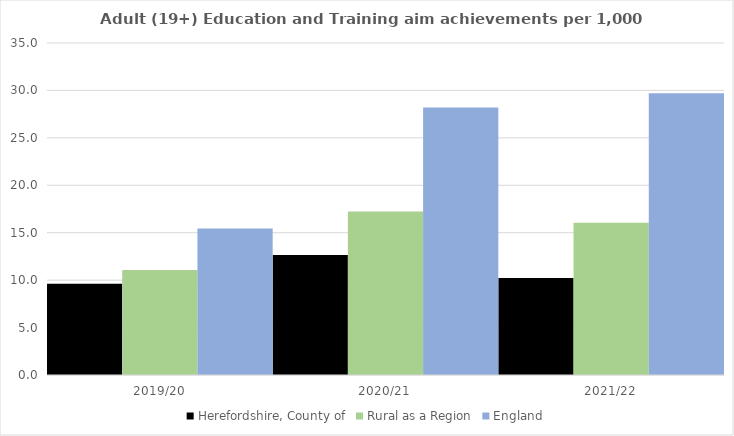
| Category | Herefordshire, County of | Rural as a Region | England |
|---|---|---|---|
| 2019/20 | 9.621 | 11.081 | 15.446 |
| 2020/21 | 12.65 | 17.224 | 28.211 |
| 2021/22 | 10.237 | 16.063 | 29.711 |